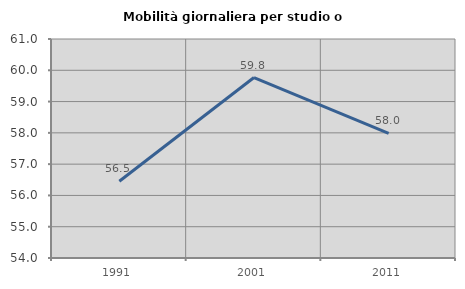
| Category | Mobilità giornaliera per studio o lavoro |
|---|---|
| 1991.0 | 56.452 |
| 2001.0 | 59.769 |
| 2011.0 | 57.98 |